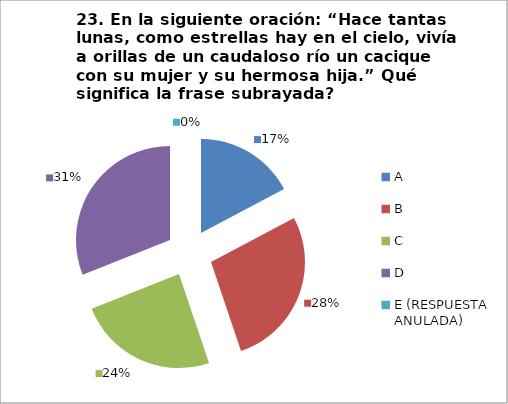
| Category | CANTIDAD DE RESPUESTAS PREGUNTA (23) | PORCENTAJE |
|---|---|---|
| A | 5 | 0.172 |
| B | 8 | 0.276 |
| C | 7 | 0.241 |
| D | 9 | 0.31 |
| E (RESPUESTA ANULADA) | 0 | 0 |